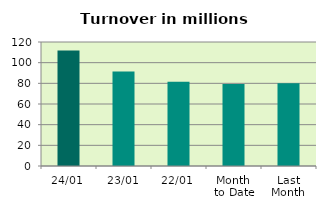
| Category | Series 0 |
|---|---|
| 24/01 | 111.863 |
| 23/01 | 91.408 |
| 22/01 | 81.509 |
| Month 
to Date | 79.45 |
| Last
Month | 79.992 |